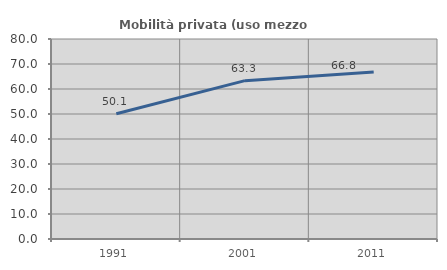
| Category | Mobilità privata (uso mezzo privato) |
|---|---|
| 1991.0 | 50.1 |
| 2001.0 | 63.339 |
| 2011.0 | 66.78 |